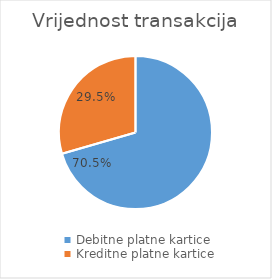
| Category | Vrijednost transakcija |
|---|---|
| Debitne platne kartice | 49326416784 |
| Kreditne platne kartice | 20622756396 |